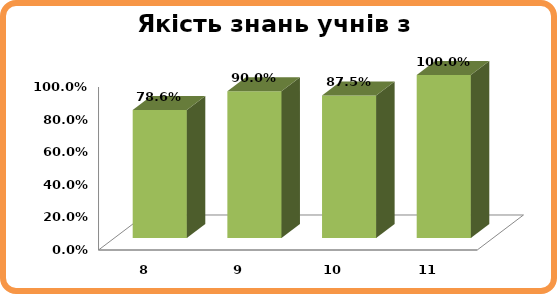
| Category | Series 0 |
|---|---|
| 8.0 | 0.786 |
| 9.0 | 0.9 |
| 10.0 | 0.875 |
| 11.0 | 1 |